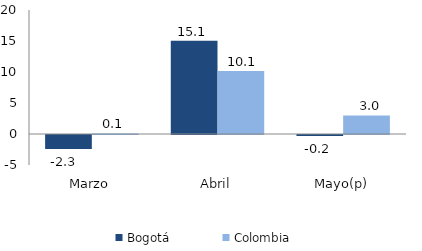
| Category | Bogotá | Colombia |
|---|---|---|
| Marzo | -2.254 | 0.082 |
| Abril | 15.052 | 10.142 |
| Mayo(p) | -0.15 | 2.986 |